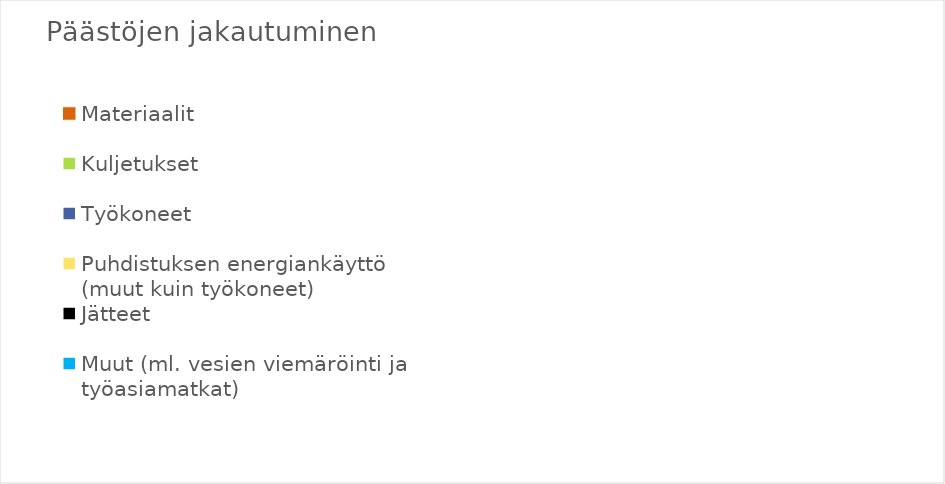
| Category | Päästöjen jakautuminen |
|---|---|
| Materiaalit | 0 |
| Kuljetukset | 0 |
| Työkoneet | 0 |
| Puhdistuksen energiankäyttö
(muut kuin työkoneet) | 0 |
| Jätteet | 0 |
| Muut (ml. vesien viemäröinti ja työasiamatkat) | 0 |